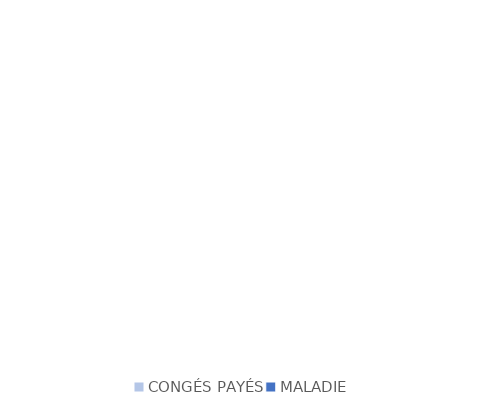
| Category | Series 0 |
|---|---|
| CONGÉS PAYÉS | 0 |
| MALADIE | 0 |